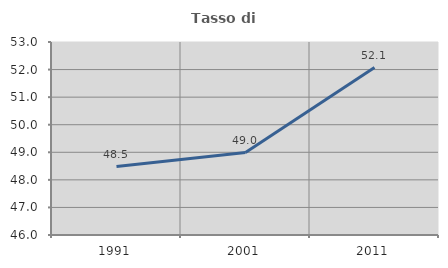
| Category | Tasso di occupazione   |
|---|---|
| 1991.0 | 48.482 |
| 2001.0 | 48.988 |
| 2011.0 | 52.073 |